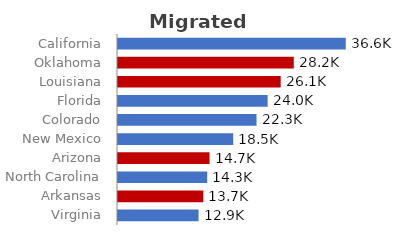
| Category | Republican | Democrat |
|---|---|---|
| Virginia | 0 | 12.938 |
| Arkansas | 13.707 | 0 |
| North Carolina | 0 | 14.329 |
| Arizona | 14.705 | 0 |
| New Mexico | 0 | 18.511 |
| Colorado | 0 | 22.253 |
| Florida | 0 | 24.039 |
| Louisiana | 26.134 | 0 |
| Oklahoma | 28.238 | 0 |
| California | 0 | 36.582 |